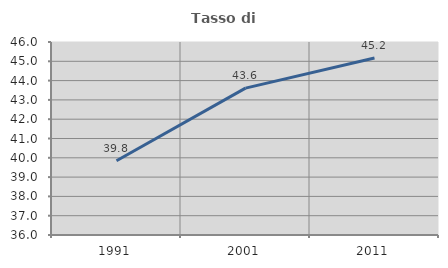
| Category | Tasso di occupazione   |
|---|---|
| 1991.0 | 39.847 |
| 2001.0 | 43.611 |
| 2011.0 | 45.168 |